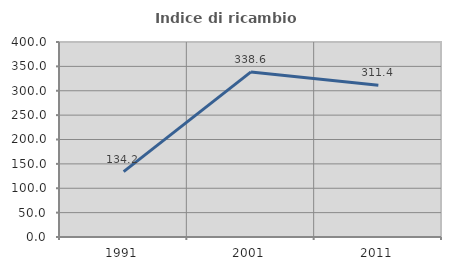
| Category | Indice di ricambio occupazionale  |
|---|---|
| 1991.0 | 134.211 |
| 2001.0 | 338.636 |
| 2011.0 | 311.429 |